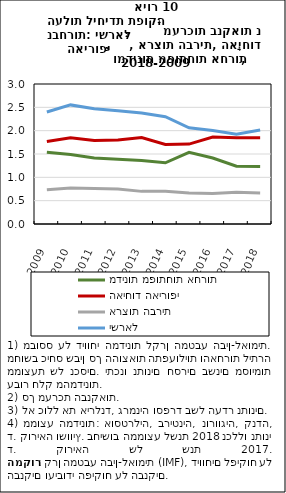
| Category | מדינות מפותחות אחרות | האיחוד האירופי | ארצות הברית | ישראל |
|---|---|---|---|---|
| 2009.0 | 1.536 | 1.768 | 0.734 | 2.399 |
| 2010.0 | 1.488 | 1.848 | 0.769 | 2.552 |
| 2011.0 | 1.414 | 1.79 | 0.76 | 2.469 |
| 2012.0 | 1.387 | 1.798 | 0.749 | 2.427 |
| 2013.0 | 1.361 | 1.852 | 0.699 | 2.377 |
| 2014.0 | 1.312 | 1.704 | 0.701 | 2.298 |
| 2015.0 | 1.536 | 1.712 | 0.665 | 2.062 |
| 2016.0 | 1.415 | 1.863 | 0.651 | 2.003 |
| 2017.0 | 1.237 | 1.846 | 0.679 | 1.925 |
| 2018.0 | 1.231 | 1.846 | 0.666 | 2.015 |